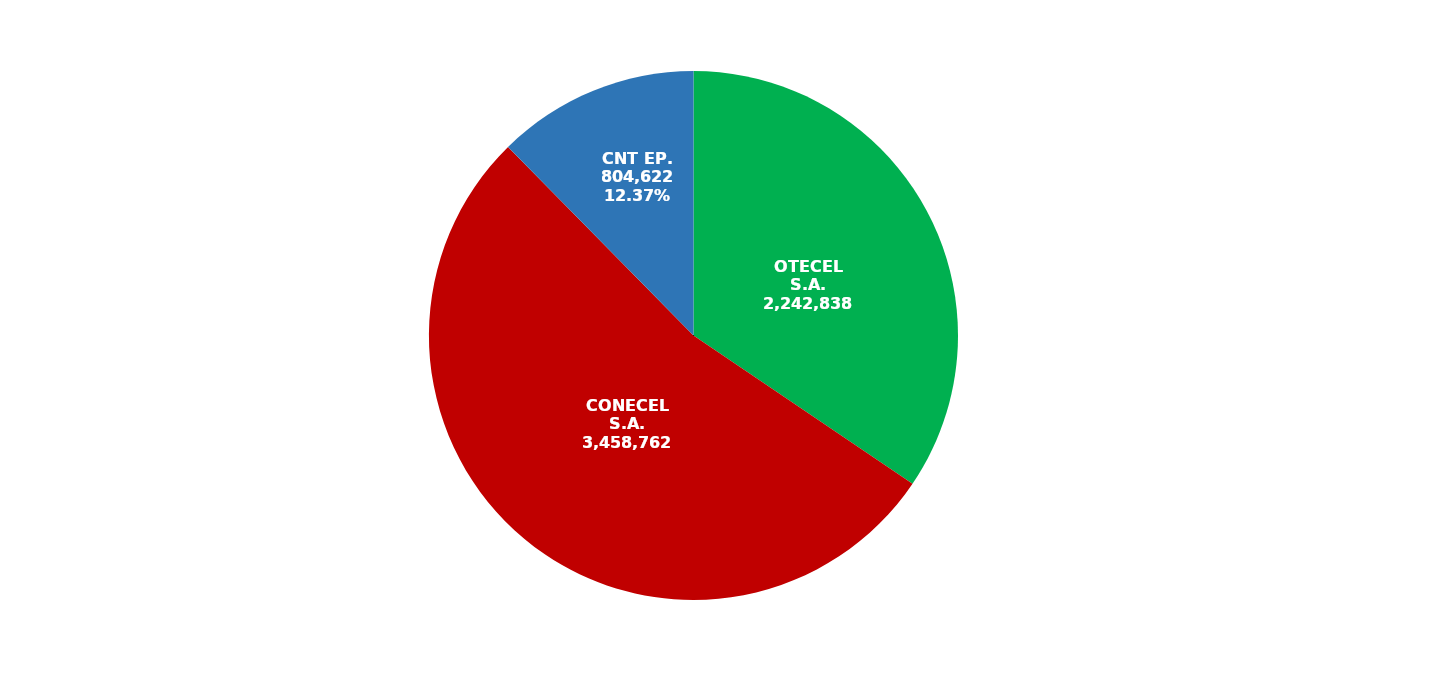
| Category | Series 0 |
|---|---|
| OTECEL S.A. | 2242838 |
| CONECEL S.A. | 3458762 |
| CNT EP. | 804622 |